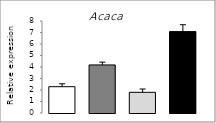
| Category | Series 0 |
|---|---|
| 0 | 2.288 |
| 1 | 4.181 |
| 2 | 1.8 |
| 3 | 7.078 |